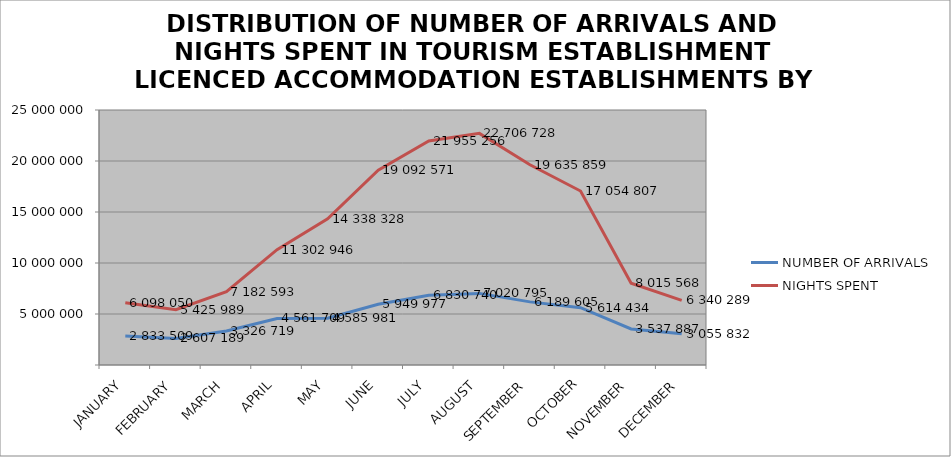
| Category | NUMBER OF ARRIVALS | NIGHTS SPENT |
|---|---|---|
| JANUARY | 2833509 | 6098050 |
| FEBRUARY | 2607189 | 5425989 |
| MARCH | 3326719 | 7182593 |
| APRIL | 4561709 | 11302946 |
| MAY | 4585981 | 14338328 |
| JUNE | 5949977 | 19092571 |
| JULY | 6830740 | 21955256 |
| AUGUST | 7020795 | 22706728 |
| SEPTEMBER | 6189605 | 19635859 |
| OCTOBER | 5614434 | 17054807 |
| NOVEMBER | 3537887 | 8015568 |
| DECEMBER | 3055832 | 6340289 |